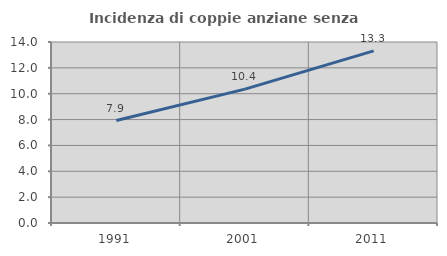
| Category | Incidenza di coppie anziane senza figli  |
|---|---|
| 1991.0 | 7.927 |
| 2001.0 | 10.355 |
| 2011.0 | 13.318 |